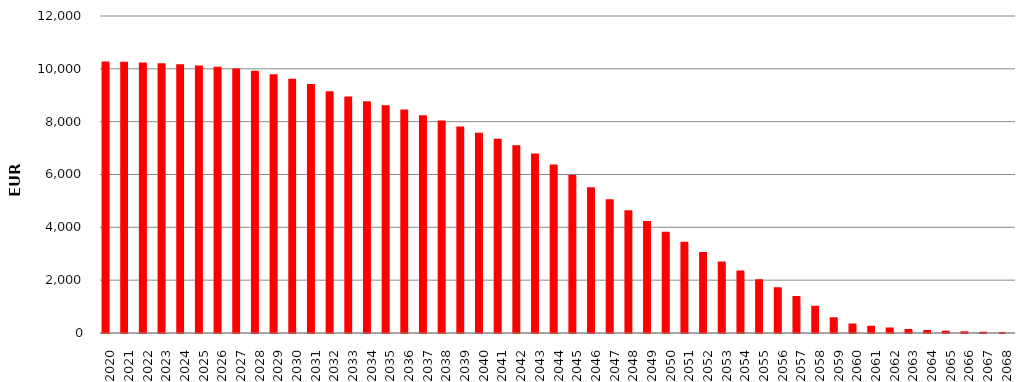
| Category |  10.236.525.366,13    | SumOfMont Cred Ced act |
|---|---|---|
| 2020 | 10235427138.08 | 1098228.05 |
| 2021 | 10225660706.54 | 9766431.54 |
| 2022 | 10204379294.87 | 21281411.67 |
| 2023 | 10171744307.65 | 32634987.22 |
| 2024 | 10131691708.36 | 40052599.29 |
| 2025 | 10089623602.72 | 42068105.64 |
| 2026 | 10038956777.77 | 50666824.95 |
| 2027 | 9970791064.06 | 68165713.71 |
| 2028 | 9886708772.1 | 84082291.96 |
| 2029 | 9754899931.41 | 131808840.69 |
| 2030 | 9591465764.68 | 163434166.73 |
| 2031 | 9389261667.11 | 202204097.57 |
| 2032 | 9114840980.68 | 274420686.43 |
| 2033 | 8916107057.96 | 198733922.72 |
| 2034 | 8733901533.48 | 182205524.48 |
| 2035 | 8581578910.9 | 152322622.58 |
| 2036 | 8420507700.57 | 161071210.33 |
| 2037 | 8209423888.68 | 211083811.89 |
| 2038 | 8004171865.86 | 205252022.82 |
| 2039 | 7774750981.02 | 229420884.84 |
| 2040 | 7538409540.57 | 236341440.45 |
| 2041 | 7312967713 | 225441827.57 |
| 2042 | 7066388874.37 | 246578838.63 |
| 2043 | 6757058183.91 | 309330690.46 |
| 2044 | 6340213240.27 | 416844943.64 |
| 2045 | 5942738057.19 | 397475183.08 |
| 2046 | 5482584382.02 | 460153675.17 |
| 2047 | 5029671256.17 | 452913125.85 |
| 2048 | 4611567389.82 | 418103866.35 |
| 2049 | 4203195461.63 | 408371928.19 |
| 2050 | 3791463810.88 | 411731650.75 |
| 2051 | 3417042095.54 | 374421715.34 |
| 2052 | 3030988462.65 | 386053632.89 |
| 2053 | 2671993048.74 | 358995413.91 |
| 2054 | 2330124960.58 | 341868088.16 |
| 2055 | 2000901780.59 | 329223179.99 |
| 2056 | 1692225475.28 | 308676305.31 |
| 2057 | 1365367400.09 | 326858075.19 |
| 2058 | 991834486.02 | 373532914.07 |
| 2059 | 556217263.91 | 435617222.11 |
| 2060 | 321485081.85 | 234732182.06 |
| 2061 | 239854962.18 | 81630119.67 |
| 2062 | 171064690.13 | 68790272.05 |
| 2063 | 111032806.23 | 60031883.9 |
| 2064 | 78973742.25 | 32059063.98 |
| 2065 | 49395002.42 | 29578739.83 |
| 2066 | 26727978.62 | 22667023.8 |
| 2067 | 9257986.49 | 17469992.13 |
| 2068 | 0 | 9257986.49 |